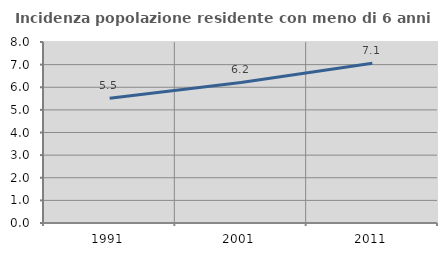
| Category | Incidenza popolazione residente con meno di 6 anni |
|---|---|
| 1991.0 | 5.512 |
| 2001.0 | 6.211 |
| 2011.0 | 7.065 |